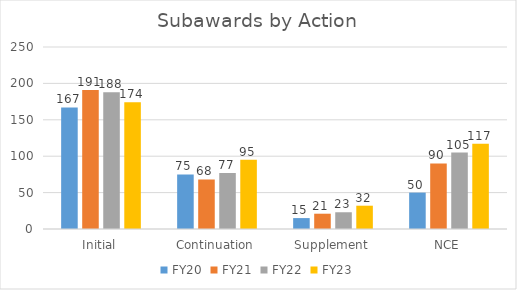
| Category | FY20 | FY21 | FY22 | FY23 |
|---|---|---|---|---|
| Initial | 167 | 191 | 188 | 174 |
| Continuation | 75 | 68 | 77 | 95 |
| Supplement | 15 | 21 | 23 | 32 |
| NCE | 50 | 90 | 105 | 117 |